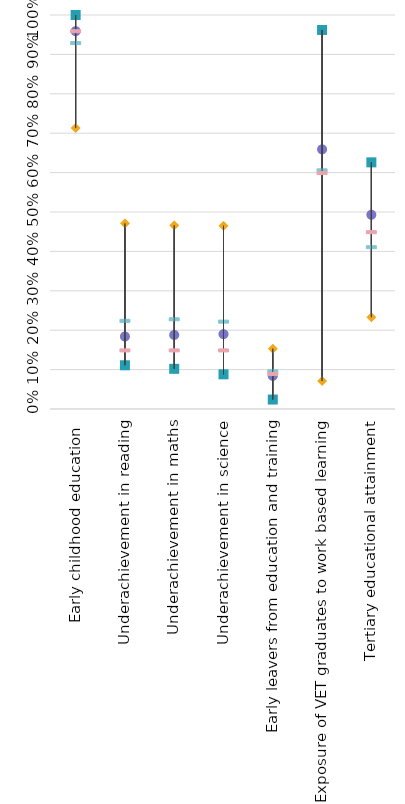
| Category | Sweden | Strongest performer | Weakest performer | EU average | EU target |
|---|---|---|---|---|---|
| Early childhood education  | 0.959 | 1 | 0.713 | 0.93 | 0.96 |
| Underachievement in reading | 0.184 | 0.111 | 0.471 | 0.225 | 0.15 |
| Underachievement in maths | 0.188 | 0.102 | 0.466 | 0.229 | 0.15 |
| Underachievement in science | 0.19 | 0.088 | 0.465 | 0.223 | 0.15 |
| Early leavers from education and training | 0.084 | 0.024 | 0.153 | 0.097 | 0.09 |
| Exposure of VET graduates to work based learning  | 0.659 | 0.962 | 0.071 | 0.607 | 0.6 |
| Tertiary educational attainment | 0.493 | 0.626 | 0.233 | 0.412 | 0.45 |